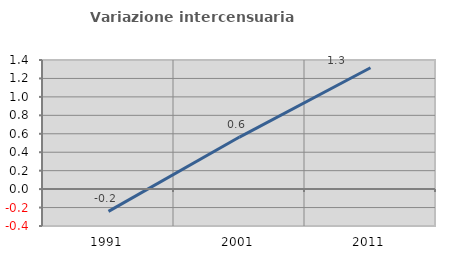
| Category | Variazione intercensuaria annua |
|---|---|
| 1991.0 | -0.242 |
| 2001.0 | 0.565 |
| 2011.0 | 1.316 |